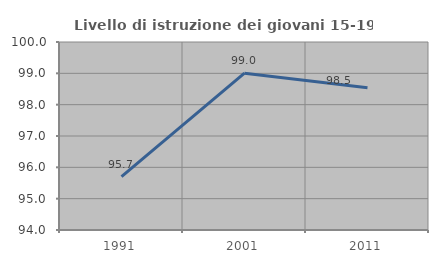
| Category | Livello di istruzione dei giovani 15-19 anni |
|---|---|
| 1991.0 | 95.703 |
| 2001.0 | 99.005 |
| 2011.0 | 98.54 |